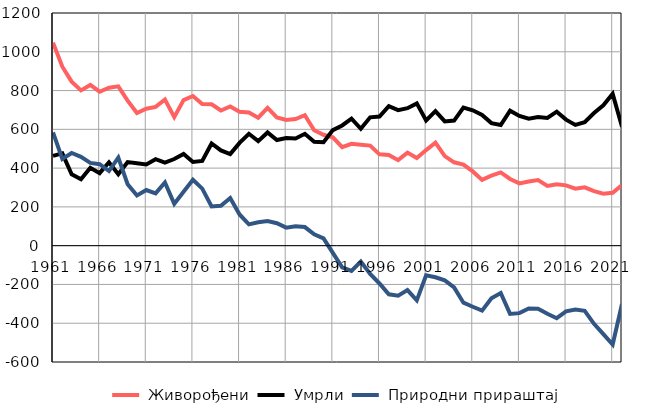
| Category |  Живорођени |  Умрли |  Природни прираштај |
|---|---|---|---|
| 1961.0 | 1047 | 463 | 584 |
| 1962.0 | 923 | 476 | 447 |
| 1963.0 | 846 | 368 | 478 |
| 1964.0 | 801 | 343 | 458 |
| 1965.0 | 829 | 402 | 427 |
| 1966.0 | 794 | 374 | 420 |
| 1967.0 | 815 | 430 | 385 |
| 1968.0 | 822 | 368 | 454 |
| 1969.0 | 748 | 431 | 317 |
| 1970.0 | 684 | 425 | 259 |
| 1971.0 | 706 | 419 | 287 |
| 1972.0 | 716 | 446 | 270 |
| 1973.0 | 754 | 428 | 326 |
| 1974.0 | 663 | 447 | 216 |
| 1975.0 | 751 | 473 | 278 |
| 1976.0 | 772 | 432 | 340 |
| 1977.0 | 731 | 437 | 294 |
| 1978.0 | 729 | 527 | 202 |
| 1979.0 | 697 | 491 | 206 |
| 1980.0 | 718 | 472 | 246 |
| 1981.0 | 691 | 530 | 161 |
| 1982.0 | 687 | 577 | 110 |
| 1983.0 | 660 | 539 | 121 |
| 1984.0 | 711 | 584 | 127 |
| 1985.0 | 661 | 545 | 116 |
| 1986.0 | 648 | 555 | 93 |
| 1987.0 | 653 | 553 | 100 |
| 1988.0 | 673 | 577 | 96 |
| 1989.0 | 595 | 536 | 59 |
| 1990.0 | 572 | 534 | 38 |
| 1991.0 | 559 | 596 | -37 |
| 1992.0 | 508 | 620 | -112 |
| 1993.0 | 525 | 655 | -130 |
| 1994.0 | 521 | 603 | -82 |
| 1995.0 | 516 | 662 | -146 |
| 1996.0 | 471 | 666 | -195 |
| 1997.0 | 468 | 719 | -251 |
| 1998.0 | 441 | 699 | -258 |
| 1999.0 | 480 | 709 | -229 |
| 2000.0 | 452 | 734 | -282 |
| 2001.0 | 493 | 646 | -153 |
| 2002.0 | 531 | 694 | -163 |
| 2003.0 | 462 | 641 | -179 |
| 2004.0 | 430 | 645 | -215 |
| 2005.0 | 418 | 712 | -294 |
| 2006.0 | 383 | 698 | -315 |
| 2007.0 | 339 | 674 | -335 |
| 2008.0 | 361 | 632 | -271 |
| 2009.0 | 378 | 622 | -244 |
| 2010.0 | 344 | 696 | -352 |
| 2011.0 | 321 | 669 | -348 |
| 2012.0 | 331 | 655 | -324 |
| 2013.0 | 338 | 663 | -325 |
| 2014.0 | 308 | 659 | -351 |
| 2015.0 | 317 | 691 | -374 |
| 2016.0 | 311 | 650 | -339 |
| 2017.0 | 294 | 623 | -329 |
| 2018.0 | 301 | 637 | -336 |
| 2019.0 | 281 | 684 | -403 |
| 2020.0 | 268 | 724 | -456 |
| 2021.0 | 273 | 783 | -510 |
| 2022.0 | 312 | 613 | -301 |